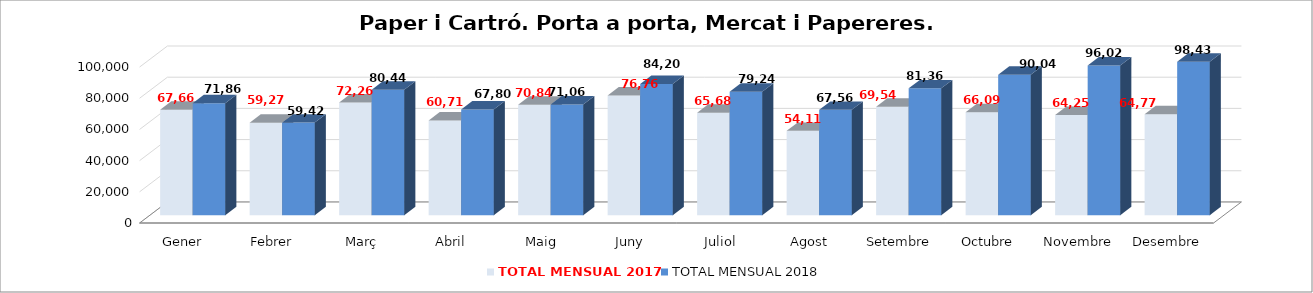
| Category | TOTAL MENSUAL 2017 | TOTAL MENSUAL 2018 |
|---|---|---|
| Gener | 67660 | 71860 |
| Febrer | 59271 | 59420 |
| Març | 72263.45 | 80440 |
| Abril | 60711.72 | 67800 |
| Maig | 70845 | 71066.67 |
| Juny | 76760 | 84208.42 |
| Juliol | 65688 | 79242.85 |
| Agost | 54116 | 67563.08 |
| Setembre | 69541.14 | 81360 |
| Octubre | 66092.82 | 90045.09 |
| Novembre | 64254 | 96020 |
| Desembre | 64774 | 98430 |